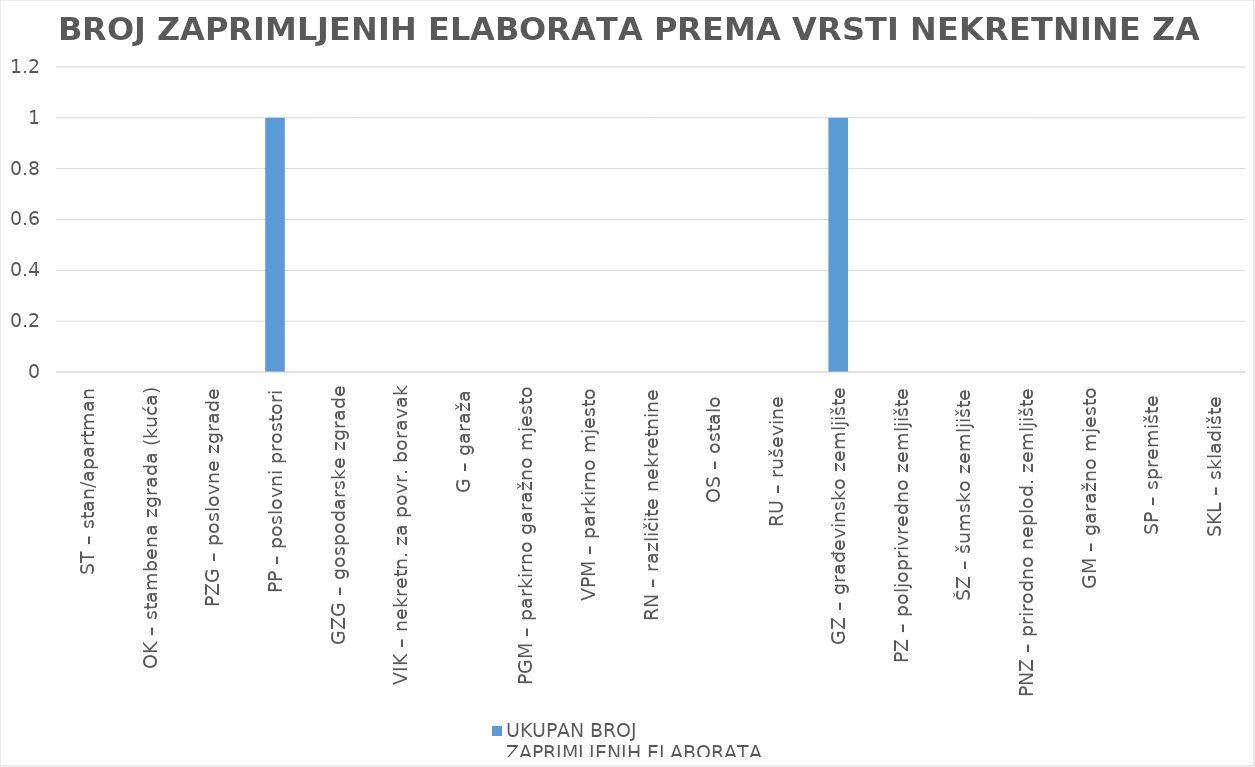
| Category | UKUPAN BROJ 
ZAPRIMLJENIH ELABORATA |
|---|---|
| ST – stan/apartman | 0 |
| OK – stambena zgrada (kuća) | 0 |
| PZG – poslovne zgrade | 0 |
| PP – poslovni prostori | 1 |
| GZG – gospodarske zgrade | 0 |
| VIK – nekretn. za povr. boravak | 0 |
| G – garaža | 0 |
| PGM – parkirno garažno mjesto | 0 |
| VPM – parkirno mjesto | 0 |
| RN – različite nekretnine | 0 |
| OS – ostalo  | 0 |
| RU – ruševine  | 0 |
| GZ – građevinsko zemljište | 1 |
| PZ – poljoprivredno zemljište | 0 |
| ŠZ – šumsko zemljište | 0 |
| PNZ – prirodno neplod. zemljište | 0 |
| GM – garažno mjesto | 0 |
| SP – spremište  | 0 |
| SKL – skladište  | 0 |